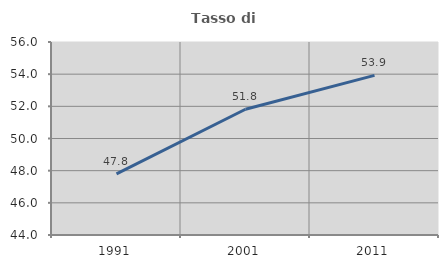
| Category | Tasso di occupazione   |
|---|---|
| 1991.0 | 47.8 |
| 2001.0 | 51.818 |
| 2011.0 | 53.927 |